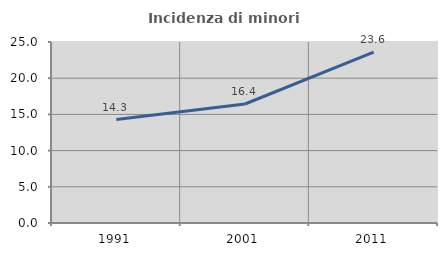
| Category | Incidenza di minori stranieri |
|---|---|
| 1991.0 | 14.286 |
| 2001.0 | 16.438 |
| 2011.0 | 23.588 |